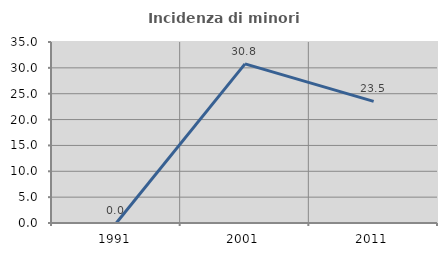
| Category | Incidenza di minori stranieri |
|---|---|
| 1991.0 | 0 |
| 2001.0 | 30.769 |
| 2011.0 | 23.529 |